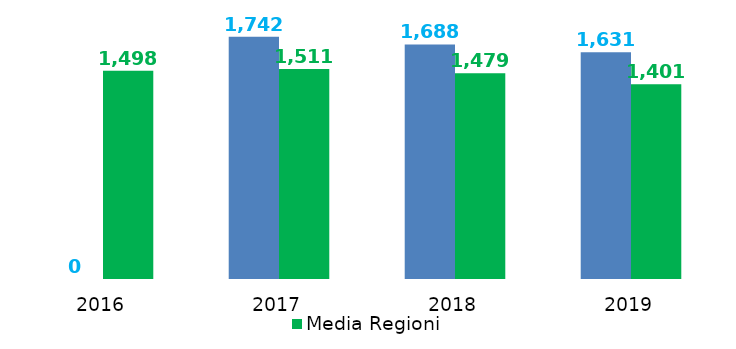
| Category | Indebitamento procapite | Media Regioni |
|---|---|---|
| 2016.0 | 0 | 1497.657 |
| 2017.0 | 1741.947 | 1511.45 |
| 2018.0 | 1687.717 | 1479.43 |
| 2019.0 | 1631.029 | 1400.855 |